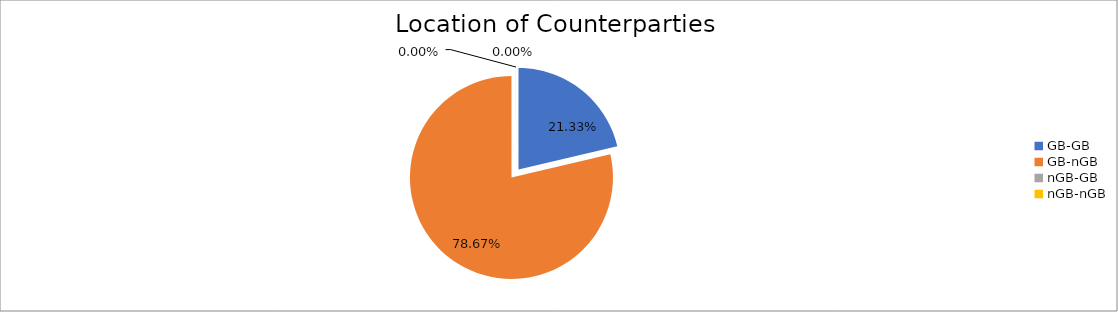
| Category | Series 0 |
|---|---|
| GB-GB | 1973383.795 |
| GB-nGB | 7279319.609 |
| nGB-GB | 336.971 |
| nGB-nGB | 442.908 |